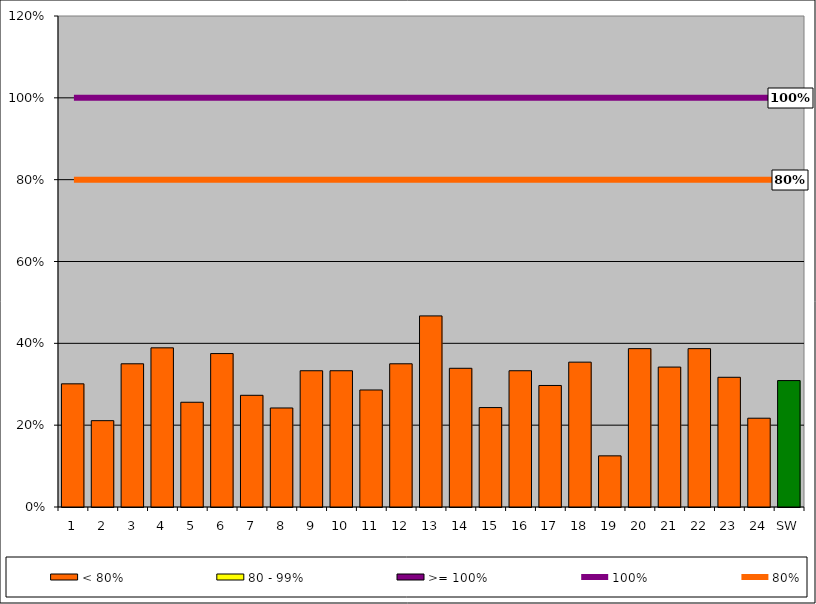
| Category | < 80% | 80 - 99% | >= 100% |
|---|---|---|---|
| 1 | 0.301 | 0 | 0 |
| 2 | 0.211 | 0 | 0 |
| 3 | 0.35 | 0 | 0 |
| 4 | 0.389 | 0 | 0 |
| 5 | 0.256 | 0 | 0 |
| 6 | 0.375 | 0 | 0 |
| 7 | 0.273 | 0 | 0 |
| 8 | 0.242 | 0 | 0 |
| 9 | 0.333 | 0 | 0 |
| 10 | 0.333 | 0 | 0 |
| 11 | 0.286 | 0 | 0 |
| 12 | 0.35 | 0 | 0 |
| 13 | 0.467 | 0 | 0 |
| 14 | 0.339 | 0 | 0 |
| 15 | 0.243 | 0 | 0 |
| 16 | 0.333 | 0 | 0 |
| 17 | 0.297 | 0 | 0 |
| 18 | 0.354 | 0 | 0 |
| 19 | 0.125 | 0 | 0 |
| 20 | 0.387 | 0 | 0 |
| 21 | 0.342 | 0 | 0 |
| 22 | 0.387 | 0 | 0 |
| 23 | 0.317 | 0 | 0 |
| 24 | 0.217 | 0 | 0 |
| SW | 0.309 | 0 | 0 |